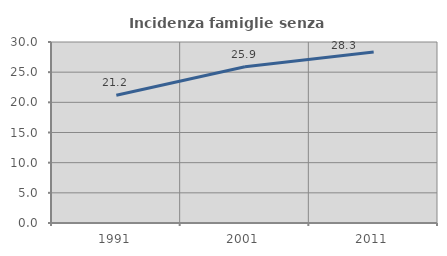
| Category | Incidenza famiglie senza nuclei |
|---|---|
| 1991.0 | 21.17 |
| 2001.0 | 25.89 |
| 2011.0 | 28.333 |